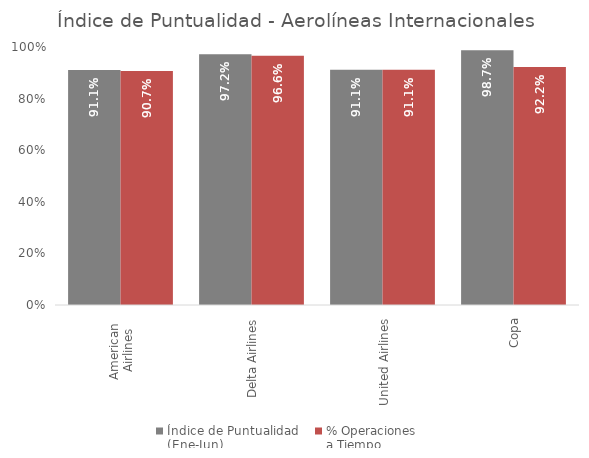
| Category | Índice de Puntualidad
(Ene-Jun) | % Operaciones 
a Tiempo |
|---|---|---|
| American 
Airlines | 0.911 | 0.907 |
| Delta Airlines | 0.972 | 0.966 |
| United Airlines | 0.911 | 0.911 |
| Copa | 0.987 | 0.922 |